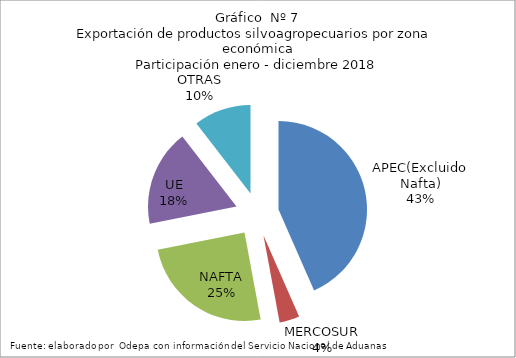
| Category | Series 0 |
|---|---|
| APEC(Excluido Nafta) | 7691255.209 |
| MERCOSUR | 649440.922 |
| NAFTA | 4390304.281 |
| UE | 3130441.004 |
| OTRAS | 1855845.584 |